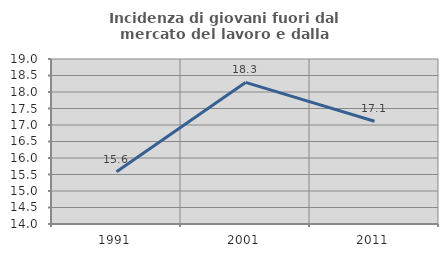
| Category | Incidenza di giovani fuori dal mercato del lavoro e dalla formazione  |
|---|---|
| 1991.0 | 15.582 |
| 2001.0 | 18.29 |
| 2011.0 | 17.112 |